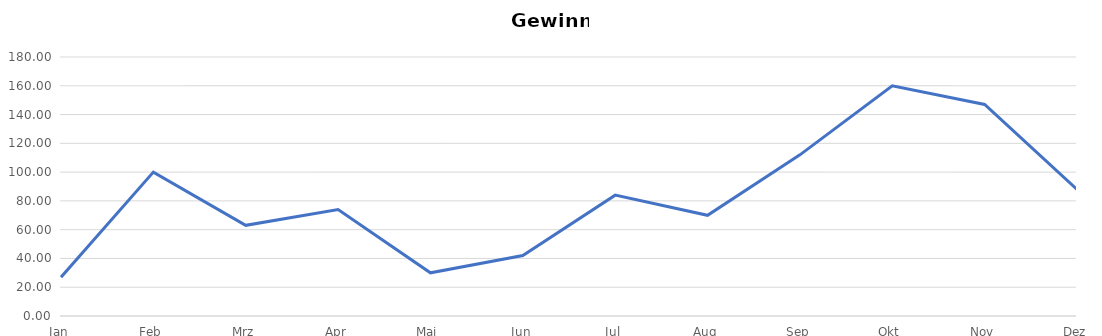
| Category | Gewinn/Verlust |
|---|---|
| Jan | 27 |
| Feb | 100 |
| Mrz | 63 |
| Apr | 74 |
| Mai | 30 |
| Jun | 42 |
| Jul | 84 |
| Aug | 70 |
| Sep | 112 |
| Okt | 160 |
| Nov | 147 |
| Dez | 88 |